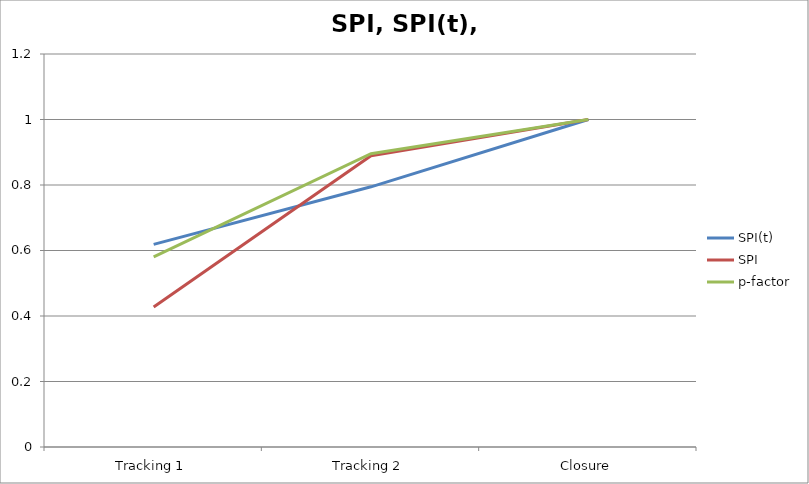
| Category | SPI(t) | SPI | p-factor |
|---|---|---|---|
| Tracking 1 | 0.619 | 0.427 | 0.58 |
| Tracking 2 | 0.794 | 0.889 | 0.896 |
| Closure | 1 | 1 | 1 |